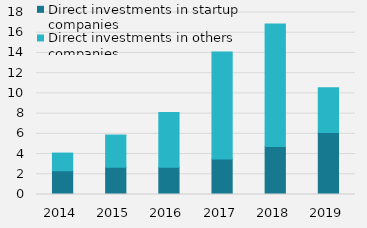
| Category | Direct investments in startup companies | Direct investments in others companies |
|---|---|---|
| 2014 | 2347.742 | 1747.895 |
| 2015 | 2696.706 | 3183.555 |
| 2016 | 2698.547 | 5399.621 |
| 2017 | 3515.763 | 10589.22 |
| 2018 | 4751.049 | 12114.385 |
| 2019 | 6143.128 | 4405.633 |